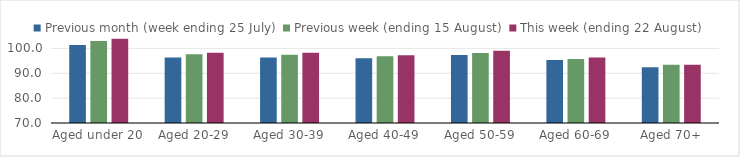
| Category | Previous month (week ending 25 July) | Previous week (ending 15 August) | This week (ending 22 August) |
|---|---|---|---|
| Aged under 20 | 101.342 | 102.953 | 103.917 |
| Aged 20-29 | 96.334 | 97.693 | 98.26 |
| Aged 30-39 | 96.342 | 97.451 | 98.283 |
| Aged 40-49 | 96.079 | 96.901 | 97.281 |
| Aged 50-59 | 97.332 | 98.117 | 99.062 |
| Aged 60-69 | 95.347 | 95.764 | 96.333 |
| Aged 70+ | 92.459 | 93.443 | 93.472 |